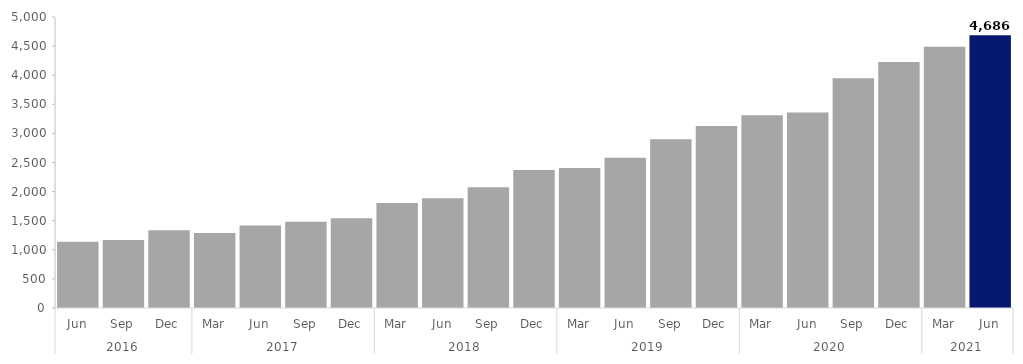
| Category | Series 0 |
|---|---|
| 0 | 1137 |
| 1 | 1167 |
| 2 | 1338 |
| 3 | 1290 |
| 4 | 1419 |
| 5 | 1482 |
| 6 | 1542 |
| 7 | 1806 |
| 8 | 1887 |
| 9 | 2076 |
| 10 | 2373 |
| 11 | 2406 |
| 12 | 2580 |
| 13 | 2901 |
| 14 | 3126 |
| 15 | 3312 |
| 16 | 3360 |
| 17 | 3948 |
| 18 | 4227 |
| 19 | 4488 |
| 20 | 4686 |